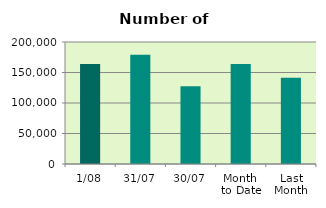
| Category | Series 0 |
|---|---|
| 1/08 | 163736 |
| 31/07 | 179166 |
| 30/07 | 127368 |
| Month 
to Date | 163736 |
| Last
Month | 141432.273 |